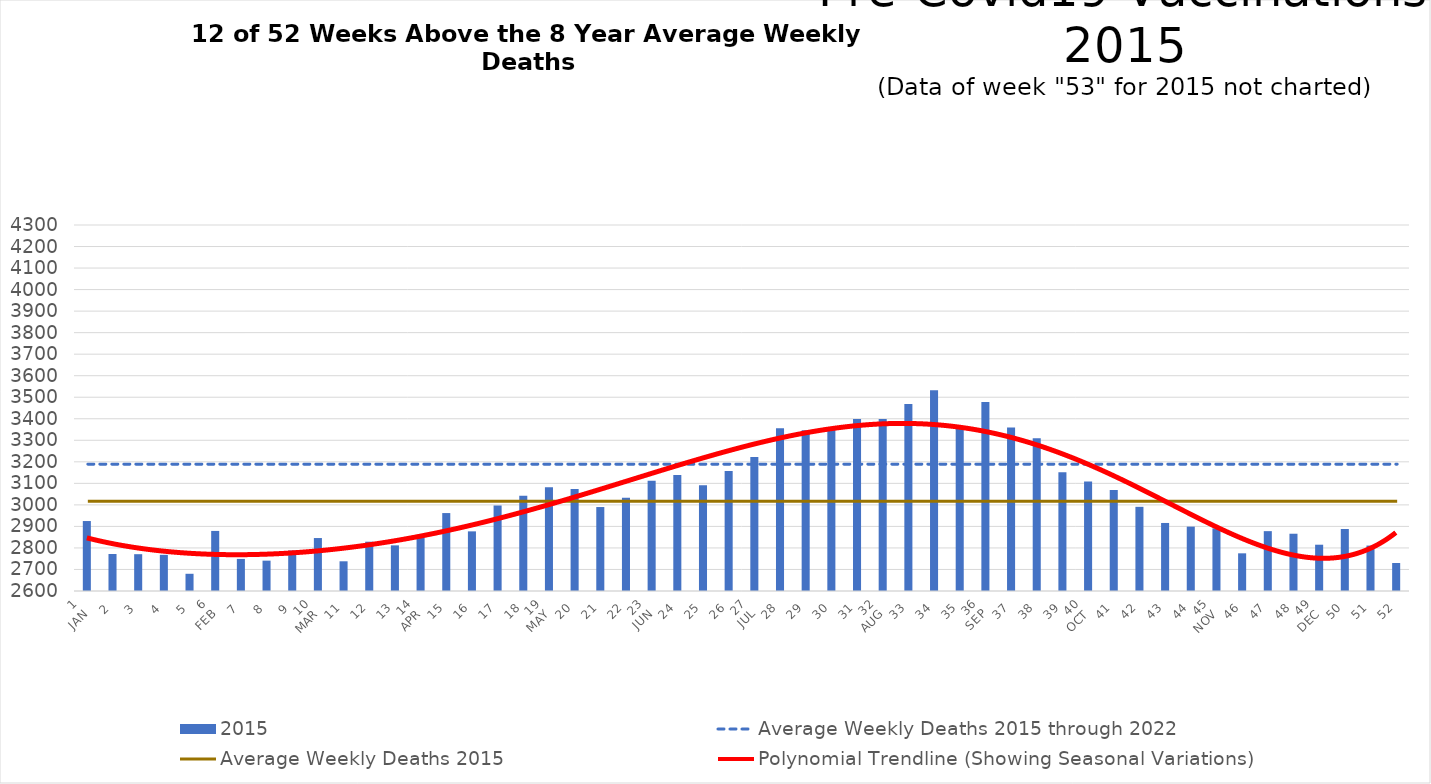
| Category | 2015 |
|---|---|
| 1
JAN | 2925 |
| 2 | 2772 |
| 3 | 2771 |
| 4 | 2768 |
| 5 | 2680 |
| 6
FEB | 2879 |
| 7 | 2749 |
| 8 | 2741 |
| 9 | 2788 |
| 10
MAR | 2846 |
| 11 | 2738 |
| 12 | 2829 |
| 13 | 2812 |
| 14
APR | 2849 |
| 15 | 2962 |
| 16 | 2877 |
| 17 | 2997 |
| 18 | 3042 |
| 19
MAY | 3082 |
| 20 | 3074 |
| 21 | 2990 |
| 22 | 3033 |
| 23
JUN | 3112 |
| 24 | 3139 |
| 25 | 3091 |
| 26 | 3157 |
| 27
JUL | 3222 |
| 28 | 3356 |
| 29 | 3347 |
| 30 | 3362 |
| 31 | 3399 |
| 32
AUG | 3399 |
| 33 | 3468 |
| 34 | 3532 |
| 35 | 3359 |
| 36
SEP | 3478 |
| 37 | 3359 |
| 38 | 3310 |
| 39 | 3152 |
| 40
OCT | 3109 |
| 41 | 3069 |
| 42 | 2991 |
| 43 | 2916 |
| 44 | 2899 |
| 45
NOV | 2891 |
| 46 | 2775 |
| 47 | 2878 |
| 48 | 2866 |
| 49
DEC | 2815 |
| 50 | 2888 |
| 51 | 2811 |
| 52 | 2730 |